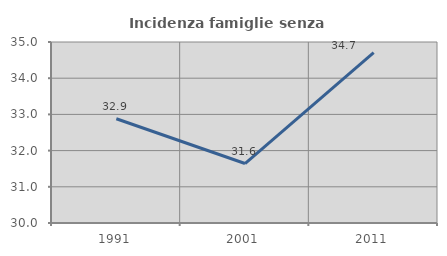
| Category | Incidenza famiglie senza nuclei |
|---|---|
| 1991.0 | 32.88 |
| 2001.0 | 31.643 |
| 2011.0 | 34.705 |